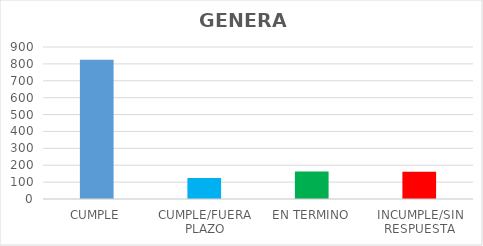
| Category | TOTAL |
|---|---|
| CUMPLE | 824 |
| CUMPLE/FUERA PLAZO | 125 |
| EN TERMINO | 163 |
| INCUMPLE/SIN RESPUESTA | 161 |